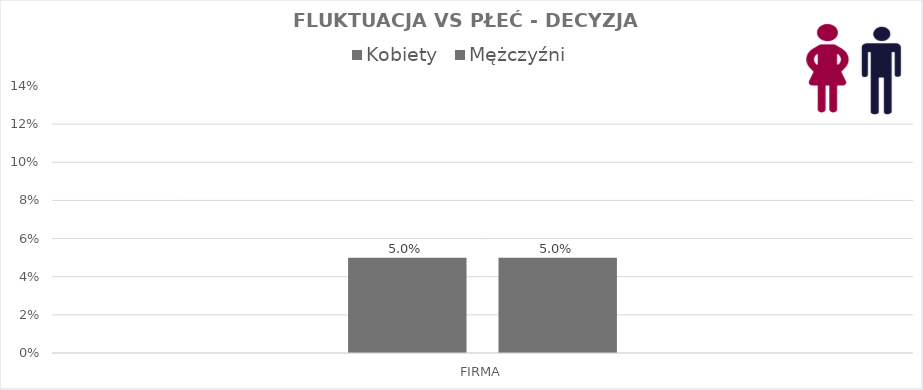
| Category | Kobiety  | Mężczyźni |
|---|---|---|
| FIRMA | 0.05 | 0.05 |